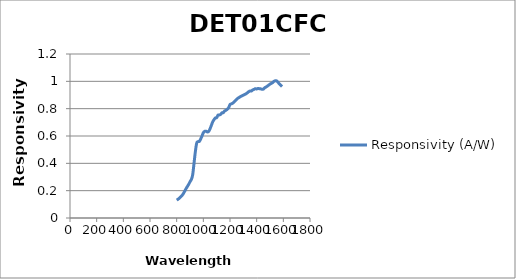
| Category | Responsivity (A/W) |
|---|---|
| 800.0 | 0.131 |
| 810.0 | 0.137 |
| 820.0 | 0.145 |
| 830.0 | 0.154 |
| 840.0 | 0.165 |
| 850.0 | 0.178 |
| 860.0 | 0.196 |
| 870.0 | 0.214 |
| 880.0 | 0.23 |
| 890.0 | 0.246 |
| 900.0 | 0.265 |
| 910.0 | 0.282 |
| 920.0 | 0.316 |
| 930.0 | 0.399 |
| 940.0 | 0.484 |
| 950.0 | 0.548 |
| 960.0 | 0.559 |
| 970.0 | 0.56 |
| 980.0 | 0.578 |
| 990.0 | 0.6 |
| 1000.0 | 0.624 |
| 1010.0 | 0.634 |
| 1020.0 | 0.635 |
| 1030.0 | 0.63 |
| 1040.0 | 0.633 |
| 1050.0 | 0.652 |
| 1060.0 | 0.677 |
| 1070.0 | 0.703 |
| 1080.0 | 0.719 |
| 1090.0 | 0.732 |
| 1100.0 | 0.734 |
| 1110.0 | 0.753 |
| 1120.0 | 0.754 |
| 1130.0 | 0.758 |
| 1140.0 | 0.77 |
| 1150.0 | 0.771 |
| 1160.0 | 0.784 |
| 1170.0 | 0.788 |
| 1180.0 | 0.797 |
| 1190.0 | 0.808 |
| 1200.0 | 0.83 |
| 1210.0 | 0.835 |
| 1220.0 | 0.84 |
| 1230.0 | 0.849 |
| 1240.0 | 0.859 |
| 1250.0 | 0.868 |
| 1260.0 | 0.877 |
| 1270.0 | 0.883 |
| 1280.0 | 0.889 |
| 1290.0 | 0.894 |
| 1300.0 | 0.899 |
| 1310.0 | 0.904 |
| 1320.0 | 0.909 |
| 1330.0 | 0.916 |
| 1340.0 | 0.924 |
| 1350.0 | 0.929 |
| 1360.0 | 0.929 |
| 1370.0 | 0.937 |
| 1380.0 | 0.941 |
| 1390.0 | 0.946 |
| 1400.0 | 0.944 |
| 1410.0 | 0.948 |
| 1420.0 | 0.946 |
| 1430.0 | 0.945 |
| 1440.0 | 0.942 |
| 1450.0 | 0.943 |
| 1460.0 | 0.953 |
| 1470.0 | 0.958 |
| 1480.0 | 0.965 |
| 1490.0 | 0.972 |
| 1500.0 | 0.98 |
| 1510.0 | 0.985 |
| 1520.0 | 0.991 |
| 1530.0 | 1 |
| 1540.0 | 1.004 |
| 1550.0 | 1.003 |
| 1560.0 | 0.994 |
| 1570.0 | 0.981 |
| 1580.0 | 0.972 |
| 1590.0 | 0.962 |